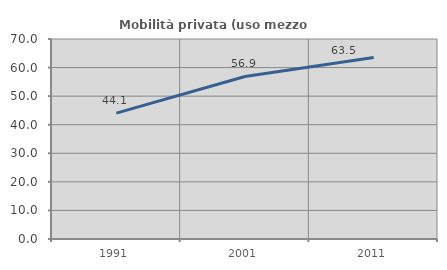
| Category | Mobilità privata (uso mezzo privato) |
|---|---|
| 1991.0 | 44.074 |
| 2001.0 | 56.893 |
| 2011.0 | 63.529 |